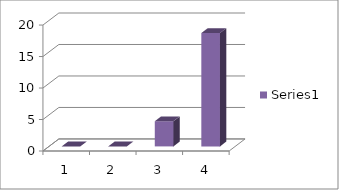
| Category | Series 0 |
|---|---|
| 0 | 0 |
| 1 | 0 |
| 2 | 4 |
| 3 | 18 |